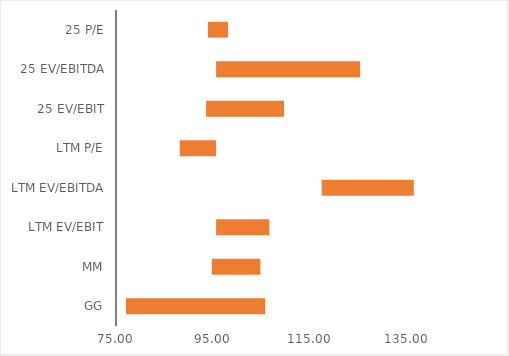
| Category | Med | Spread | Max |
|---|---|---|---|
| GG | 77.062 | 28.728 | 105.79 |
| MM | 94.735 | 10.079 | 104.814 |
| LTM EV/EBIT | 95.63 | 11.028 | 106.658 |
| LTM EV/EBITDA | 117.373 | 19.011 | 136.384 |
| LTM P/E | 88.131 | 7.499 | 95.63 |
| 25 EV/EBIT | 93.554 | 16.106 | 109.659 |
| 25 EV/EBITDA | 95.63 | 29.735 | 125.365 |
| 25 P/E | 93.923 | 4.235 | 98.158 |